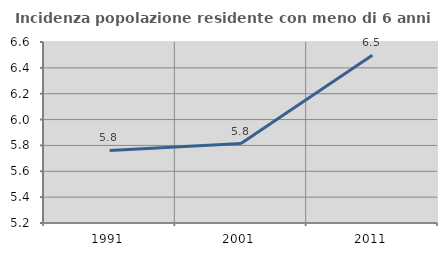
| Category | Incidenza popolazione residente con meno di 6 anni |
|---|---|
| 1991.0 | 5.761 |
| 2001.0 | 5.814 |
| 2011.0 | 6.498 |